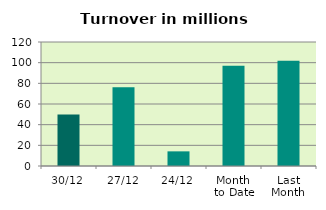
| Category | Series 0 |
|---|---|
| 30/12 | 49.85 |
| 27/12 | 76.328 |
| 24/12 | 14.17 |
| Month 
to Date | 97.129 |
| Last
Month | 101.866 |